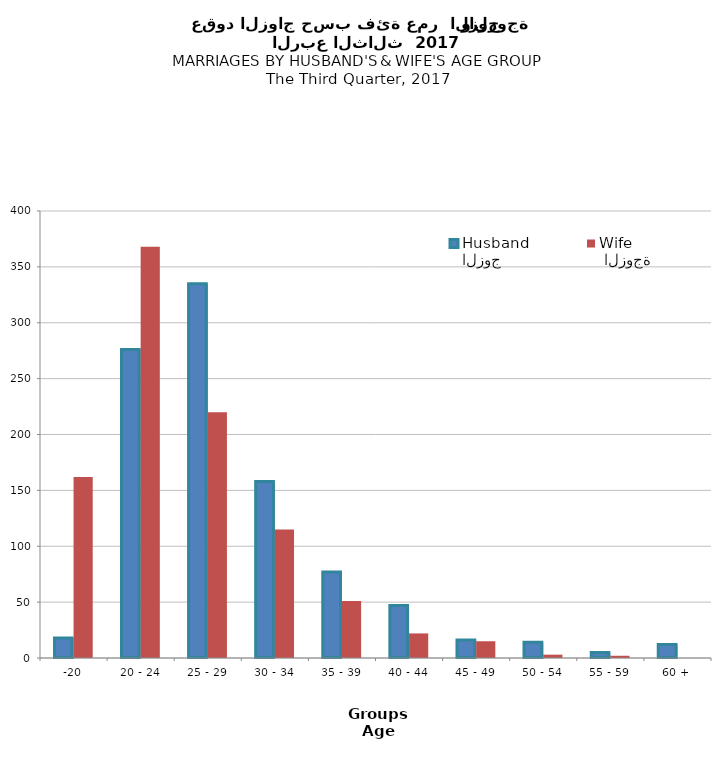
| Category | الزوج
Husband |  الزوجة
Wife |
|---|---|---|
| -20 | 18 | 162 |
| 20 - 24 | 276 | 368 |
| 25 - 29 | 335 | 220 |
| 30 - 34 | 158 | 115 |
| 35 - 39 | 77 | 51 |
| 40 - 44 | 47 | 22 |
| 45 - 49 | 16 | 15 |
| 50 - 54 | 14 | 3 |
| 55 - 59 | 5 | 2 |
| 60 + | 12 | 0 |